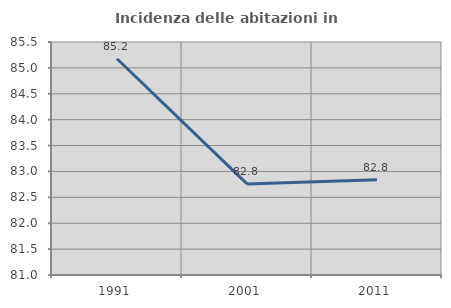
| Category | Incidenza delle abitazioni in proprietà  |
|---|---|
| 1991.0 | 85.176 |
| 2001.0 | 82.759 |
| 2011.0 | 82.838 |